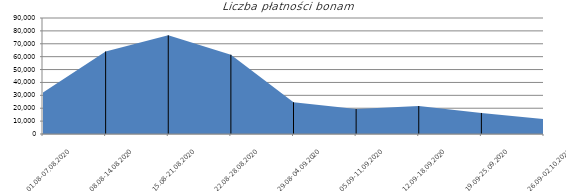
| Category | Series 2 | Series 0 |
|---|---|---|
| 01.08-07.08.2020 | 32125 |  |
| 08.08-14.08.2020 | 64030 |  |
| 15.08-21.08.2020 | 76533 |  |
| 22.08-28.08.2020 | 61508 |  |
| 29.08-04.09.2020 | 24618 |  |
| 05.09-11.09.2020 | 19360 |  |
| 12.09-18.09.2020 | 21708 |  |
| 19.09-25.09.2020 | 16322 |  |
| 26.09-02.10.2020 | 11615 |  |